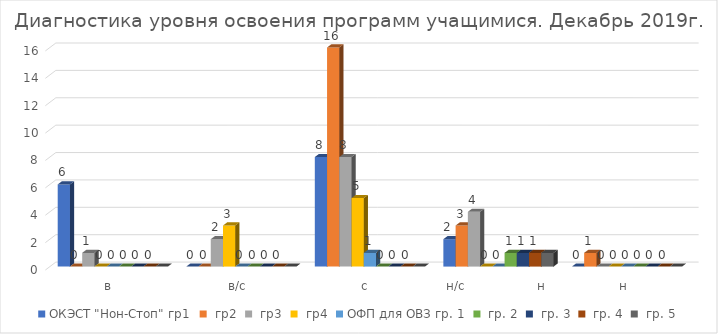
| Category | ОКЭСТ "Нон-Стоп" | ОФП для ОВЗ |
|---|---|---|
| в | 0 | 0 |
| в/с | 3 | 0 |
| с | 5 | 0 |
| н/с                  н | 0 | 1 |
| н | 0 | 0 |